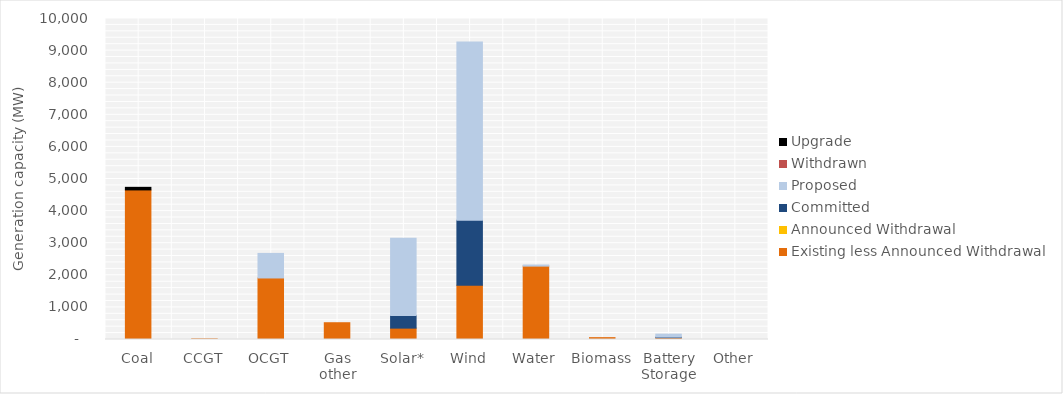
| Category | Existing less Announced Withdrawal | Announced Withdrawal | Committed | Proposed | Withdrawn | Upgrade |
|---|---|---|---|---|---|---|
| Coal | 4660 | 0 | 0 | 0 | 0 | 80 |
| CCGT | 21 | 0 | 0 | 0 | 0 | 0 |
| OCGT | 1916.8 | 0 | 0 | 765 | 0 | 0 |
| Gas other | 522.612 | 0 | 0 | 0 | 0 | 0 |
| Solar* | 354.312 | 0 | 396.02 | 2400.7 | 0 | 0 |
| Wind | 1692.85 | 0 | 2025.3 | 5549.5 | 0 | 0 |
| Water | 2286.237 | 0 | 0 | 34 | 0 | 0 |
| Biomass | 57.604 | 0 | 0 | 0 | 0 | 0 |
| Battery Storage | 55 | 0 | 20 | 92 | 0 | 0 |
| Other | 0 | 0 | 0 | 0 | 0 | 0 |